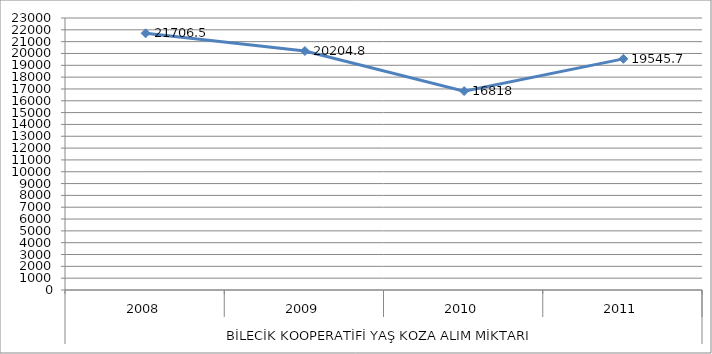
| Category | BİLECİK KOOP. |
|---|---|
| 0 | 21706.5 |
| 1 | 20204.8 |
| 2 | 16818 |
| 3 | 19545.7 |